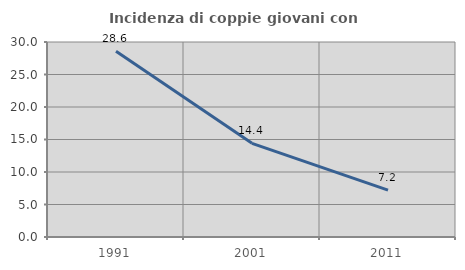
| Category | Incidenza di coppie giovani con figli |
|---|---|
| 1991.0 | 28.571 |
| 2001.0 | 14.407 |
| 2011.0 | 7.2 |